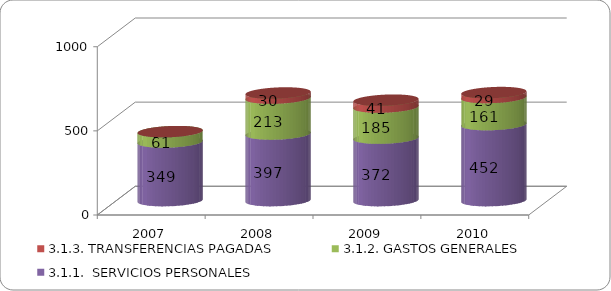
| Category | 3.1.1.  SERVICIOS PERSONALES | 3.1.2. GASTOS GENERALES | 3.1.3. TRANSFERENCIAS PAGADAS |
|---|---|---|---|
| 2007 | 348.82 | 61.272 | 0 |
| 2008 | 396.534 | 212.973 | 30.256 |
| 2009 | 371.826 | 184.504 | 40.785 |
| 2010 | 452.241 | 160.858 | 29.15 |